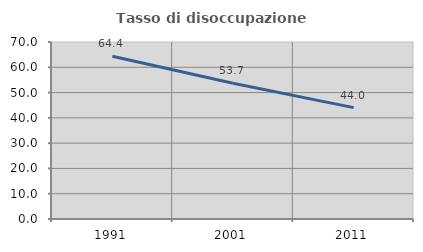
| Category | Tasso di disoccupazione giovanile  |
|---|---|
| 1991.0 | 64.373 |
| 2001.0 | 53.689 |
| 2011.0 | 44.048 |